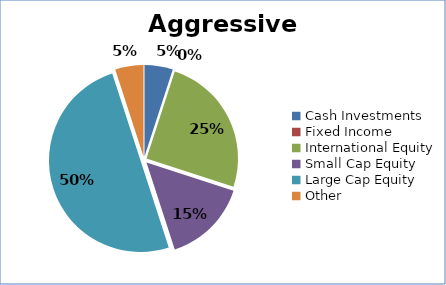
| Category | Series 0 |
|---|---|
| Cash Investments | 0.05 |
| Fixed Income | 0 |
| International Equity | 0.25 |
| Small Cap Equity | 0.15 |
| Large Cap Equity | 0.5 |
| Other | 0.05 |